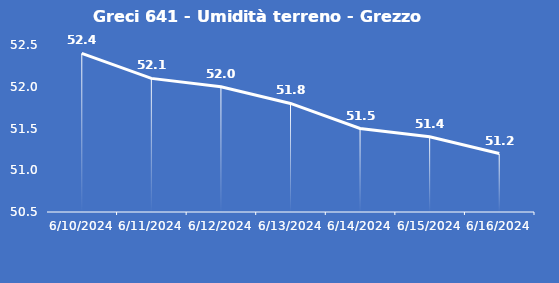
| Category | Greci 641 - Umidità terreno - Grezzo (%VWC) |
|---|---|
| 6/10/24 | 52.4 |
| 6/11/24 | 52.1 |
| 6/12/24 | 52 |
| 6/13/24 | 51.8 |
| 6/14/24 | 51.5 |
| 6/15/24 | 51.4 |
| 6/16/24 | 51.2 |